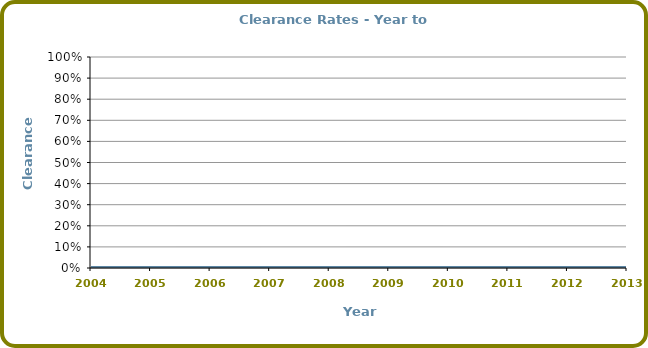
| Category | Clearance Rates |
|---|---|
| 2004.0 | 0 |
| 2005.0 | 0 |
| 2006.0 | 0 |
| 2007.0 | 0 |
| 2008.0 | 0 |
| 2009.0 | 0 |
| 2010.0 | 0 |
| 2011.0 | 0 |
| 2012.0 | 0 |
| 2013.0 | 0 |